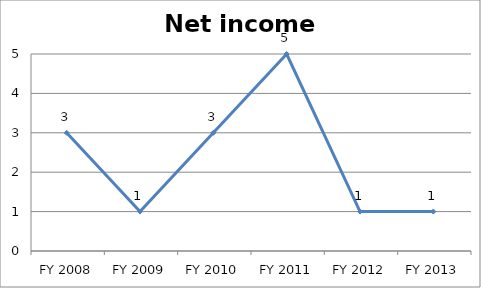
| Category | Net income score |
|---|---|
| FY 2013 | 1 |
| FY 2012 | 1 |
| FY 2011 | 5 |
| FY 2010 | 3 |
| FY 2009 | 1 |
| FY 2008 | 3 |